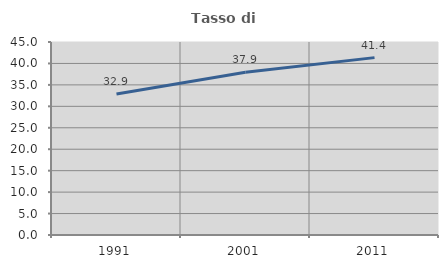
| Category | Tasso di occupazione   |
|---|---|
| 1991.0 | 32.871 |
| 2001.0 | 37.949 |
| 2011.0 | 41.359 |